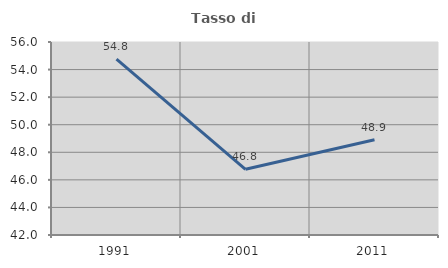
| Category | Tasso di occupazione   |
|---|---|
| 1991.0 | 54.759 |
| 2001.0 | 46.765 |
| 2011.0 | 48.908 |